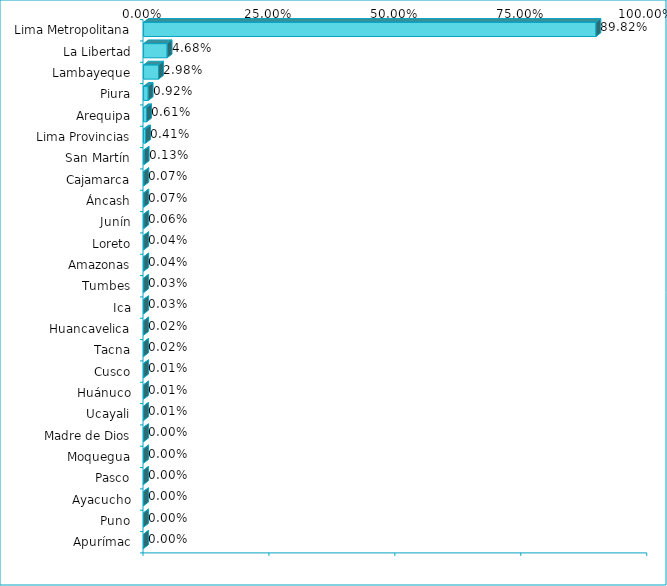
| Category | Series 0 |
|---|---|
| Lima Metropolitana | 0.898 |
| La Libertad | 0.047 |
| Lambayeque | 0.03 |
| Piura | 0.009 |
| Arequipa | 0.006 |
| Lima Provincias | 0.004 |
| San Martín | 0.001 |
| Cajamarca | 0.001 |
| Áncash | 0.001 |
| Junín | 0.001 |
| Loreto | 0 |
| Amazonas | 0 |
| Tumbes | 0 |
| Ica | 0 |
| Huancavelica | 0 |
| Tacna | 0 |
| Cusco | 0 |
| Huánuco | 0 |
| Ucayali | 0 |
| Madre de Dios | 0 |
| Moquegua | 0 |
| Pasco | 0 |
| Ayacucho | 0 |
| Puno | 0 |
| Apurímac | 0 |